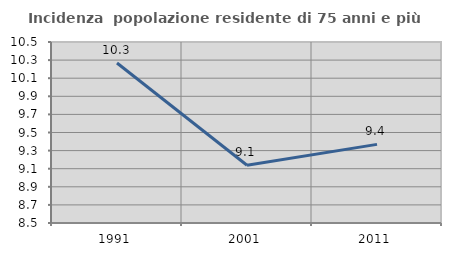
| Category | Incidenza  popolazione residente di 75 anni e più |
|---|---|
| 1991.0 | 10.268 |
| 2001.0 | 9.139 |
| 2011.0 | 9.369 |